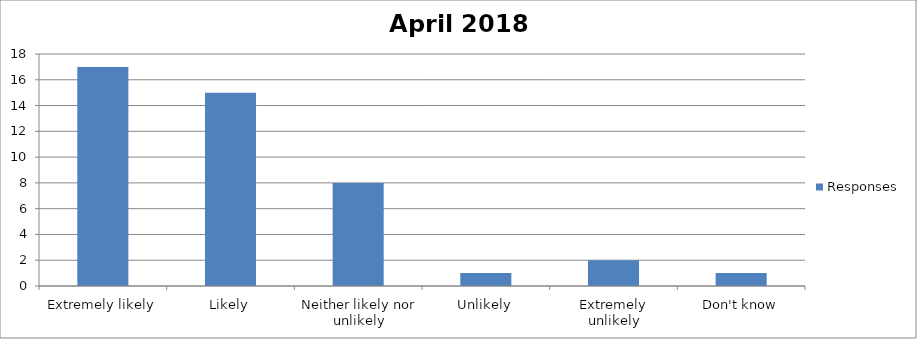
| Category | Responses |
|---|---|
| Extremely likely | 17 |
| Likely | 15 |
| Neither likely nor unlikely | 8 |
| Unlikely | 1 |
| Extremely unlikely | 2 |
| Don't know | 1 |